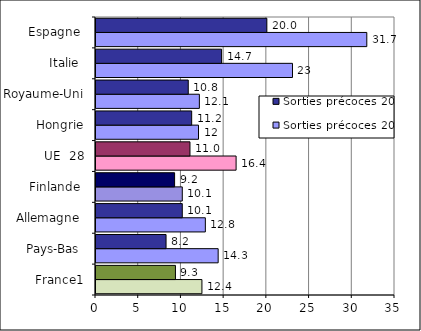
| Category | Sorties précoces 2003 | Sorties précoces 2015 |
|---|---|---|
| France1 | 12.4 | 9.3 |
| Pays-Bas  | 14.3 | 8.2 |
| Allemagne  | 12.8 | 10.1 |
| Finlande  | 10.1 | 9.2 |
| UE  28 | 16.4 | 11 |
| Hongrie | 12 | 11.2 |
| Royaume-Uni | 12.1 | 10.8 |
| Italie  | 23 | 14.7 |
| Espagne  | 31.7 | 20 |